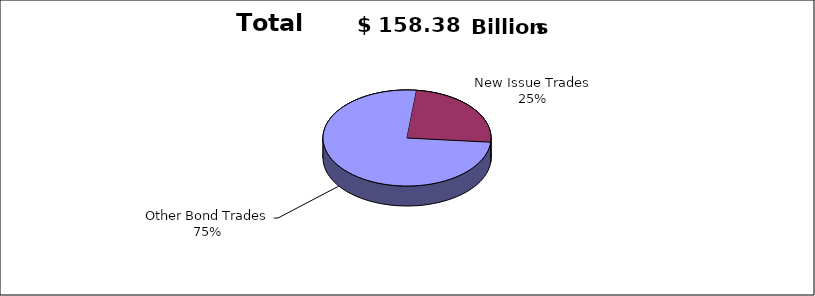
| Category | Series 0 |
|---|---|
| Other Bond Trades | 119460839682 |
| New Issue Trades | 38922845151 |